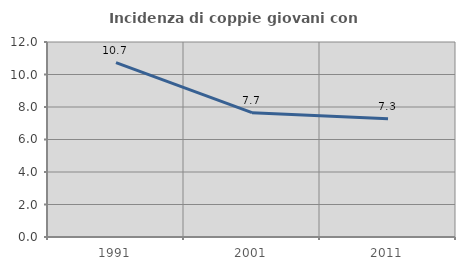
| Category | Incidenza di coppie giovani con figli |
|---|---|
| 1991.0 | 10.729 |
| 2001.0 | 7.653 |
| 2011.0 | 7.27 |